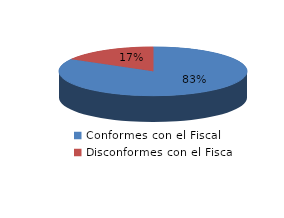
| Category | Series 0 |
|---|---|
| 0 | 10 |
| 1 | 2 |